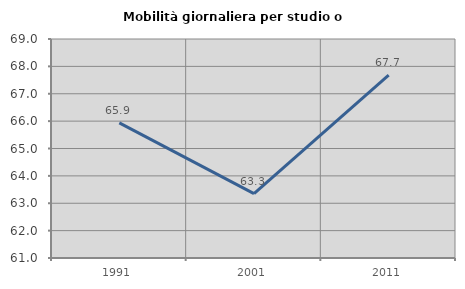
| Category | Mobilità giornaliera per studio o lavoro |
|---|---|
| 1991.0 | 65.933 |
| 2001.0 | 63.35 |
| 2011.0 | 67.678 |